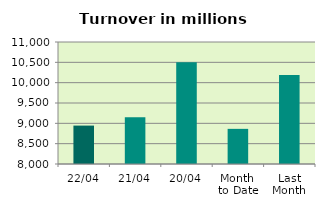
| Category | Series 0 |
|---|---|
| 22/04 | 8944.488 |
| 21/04 | 9149.929 |
| 20/04 | 10504.063 |
| Month 
to Date | 8864.205 |
| Last
Month | 10188.955 |